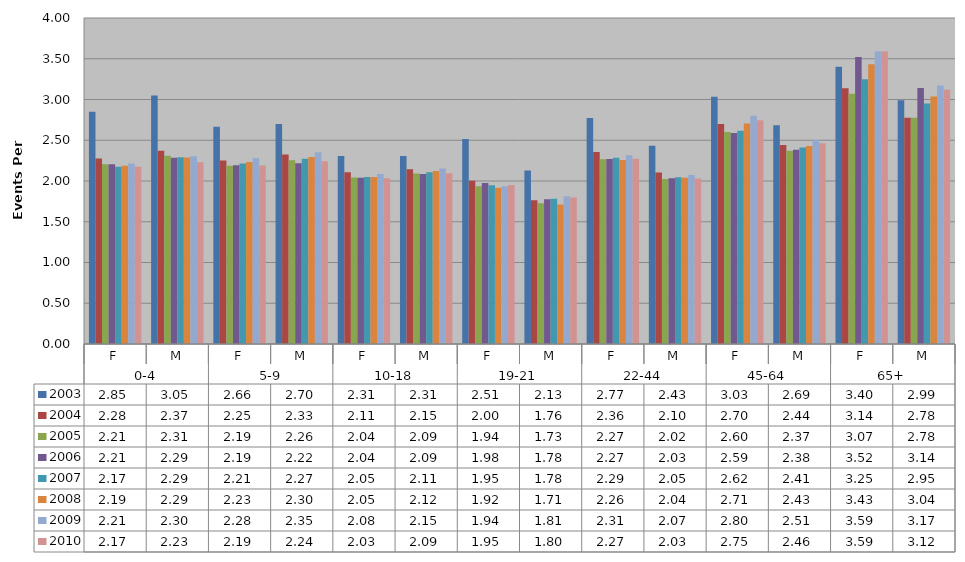
| Category | 2003 | 2004 | 2005 | 2006 | 2007 | 2008 | 2009 | 2010 |
|---|---|---|---|---|---|---|---|---|
| 0 | 2.848 | 2.277 | 2.206 | 2.206 | 2.174 | 2.188 | 2.215 | 2.175 |
| 1 | 3.048 | 2.371 | 2.309 | 2.286 | 2.29 | 2.288 | 2.303 | 2.231 |
| 2 | 2.664 | 2.251 | 2.188 | 2.194 | 2.213 | 2.233 | 2.282 | 2.19 |
| 3 | 2.698 | 2.326 | 2.256 | 2.219 | 2.272 | 2.295 | 2.351 | 2.241 |
| 4 | 2.308 | 2.108 | 2.044 | 2.04 | 2.049 | 2.048 | 2.085 | 2.034 |
| 5 | 2.307 | 2.145 | 2.093 | 2.087 | 2.108 | 2.123 | 2.155 | 2.094 |
| 6 | 2.515 | 2.004 | 1.937 | 1.977 | 1.948 | 1.918 | 1.936 | 1.95 |
| 7 | 2.13 | 1.764 | 1.726 | 1.775 | 1.781 | 1.712 | 1.813 | 1.798 |
| 8 | 2.774 | 2.357 | 2.267 | 2.269 | 2.286 | 2.258 | 2.315 | 2.272 |
| 9 | 2.432 | 2.104 | 2.024 | 2.033 | 2.045 | 2.041 | 2.073 | 2.032 |
| 10 | 3.034 | 2.699 | 2.6 | 2.588 | 2.617 | 2.706 | 2.8 | 2.746 |
| 11 | 2.685 | 2.442 | 2.372 | 2.385 | 2.41 | 2.43 | 2.505 | 2.464 |
| 12 | 3.402 | 3.138 | 3.069 | 3.521 | 3.247 | 3.432 | 3.593 | 3.592 |
| 13 | 2.992 | 2.777 | 2.778 | 3.142 | 2.952 | 3.036 | 3.172 | 3.121 |